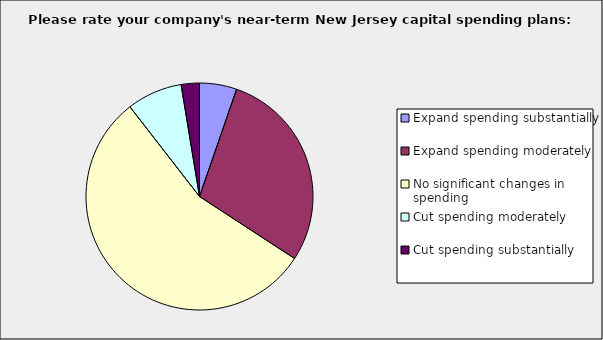
| Category | Series 0 |
|---|---|
| Expand spending substantially | 0.053 |
| Expand spending moderately | 0.289 |
| No significant changes in spending | 0.553 |
| Cut spending moderately | 0.079 |
| Cut spending substantially | 0.026 |